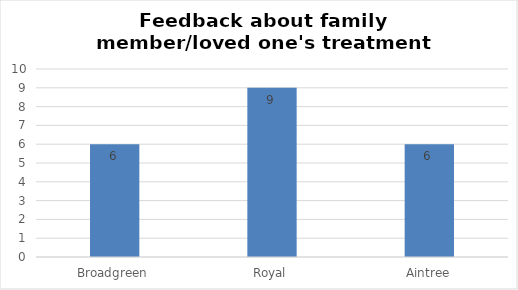
| Category | Series 0 |
|---|---|
| Broadgreen | 6 |
| Royal | 9 |
| Aintree | 6 |